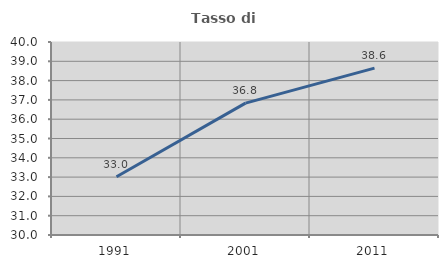
| Category | Tasso di occupazione   |
|---|---|
| 1991.0 | 33.019 |
| 2001.0 | 36.834 |
| 2011.0 | 38.646 |